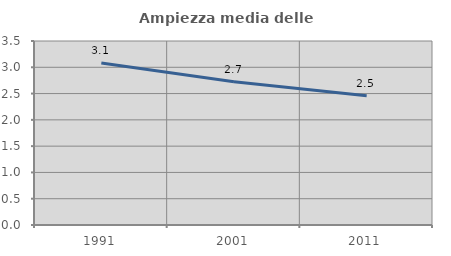
| Category | Ampiezza media delle famiglie |
|---|---|
| 1991.0 | 3.08 |
| 2001.0 | 2.726 |
| 2011.0 | 2.461 |